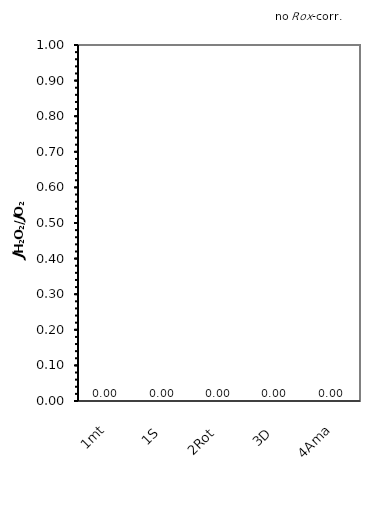
| Category | no ROX-corr. |
|---|---|
| 1mt | 0 |
| 1S | 0 |
| 2Rot | 0 |
| 3D | 0 |
| 4Ama | 0 |